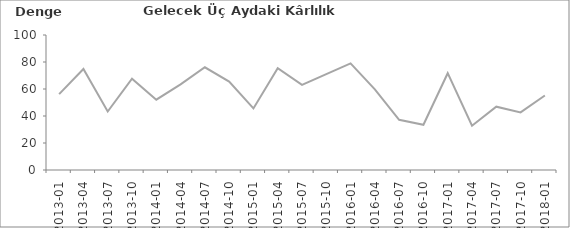
| Category | Gelecek Üç Aydaki Karlılık Beklentisi |
|---|---|
| 2013-01 | 56.2 |
| 2013-04 | 74.8 |
| 2013-07 | 43.3 |
| 2013-10 | 67.6 |
| 2014-01 | 52.1 |
| 2014-04 | 63.4 |
| 2014-07 | 76.1 |
| 2014-10 | 65.5 |
| 2015-01 | 45.6 |
| 2015-04 | 75.4 |
| 2015-07 | 63.1 |
| 2015-10 | 71 |
| 2016-01 | 79 |
| 2016-04 | 59.7 |
| 2016-07 | 37.2 |
| 2016-10 | 33.5 |
| 2017-01 | 71.7 |
| 2017-04 | 32.8 |
| 2017-07 | 46.9 |
| 2017-10 | 42.7 |
| 2018-01 | 55.2 |